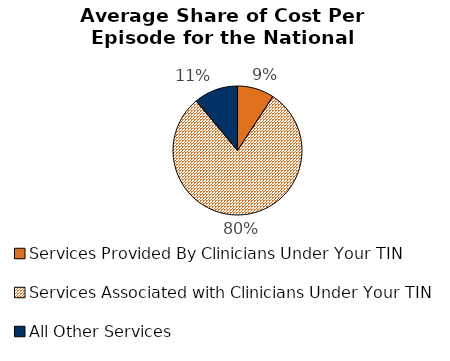
| Category | Series 2 |
|---|---|
| Services Provided By Clinicians Under Your TIN | 0.092 |
| Services Associated with Clinicians Under Your TIN | 0.797 |
| All Other Services | 0.111 |